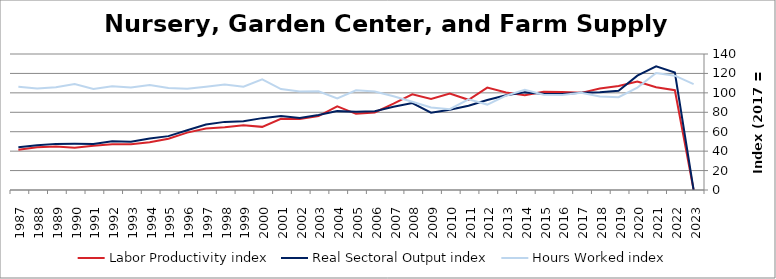
| Category | Labor Productivity index | Real Sectoral Output index | Hours Worked index |
|---|---|---|---|
| 2023.0 | 0 | 0 | 108.998 |
| 2022.0 | 102.74 | 120.933 | 117.708 |
| 2021.0 | 105.768 | 127.344 | 120.399 |
| 2020.0 | 111.733 | 117.761 | 105.394 |
| 2019.0 | 107.031 | 102.191 | 95.478 |
| 2018.0 | 104.576 | 100.656 | 96.252 |
| 2017.0 | 100 | 100 | 100 |
| 2016.0 | 100.993 | 98.719 | 97.748 |
| 2015.0 | 101.094 | 99.044 | 97.972 |
| 2014.0 | 97.437 | 100.491 | 103.134 |
| 2013.0 | 100.371 | 97.46 | 97.1 |
| 2012.0 | 105.362 | 92.647 | 87.932 |
| 2011.0 | 92.861 | 86.72 | 93.388 |
| 2010.0 | 99.325 | 82.58 | 83.141 |
| 2009.0 | 93.643 | 79.53 | 84.929 |
| 2008.0 | 98.503 | 89.439 | 90.799 |
| 2007.0 | 88.817 | 85.682 | 96.471 |
| 2006.0 | 79.822 | 80.999 | 101.475 |
| 2005.0 | 78.397 | 80.456 | 102.627 |
| 2004.0 | 86.055 | 81.193 | 94.35 |
| 2003.0 | 76.016 | 77.266 | 101.645 |
| 2002.0 | 73.075 | 74.148 | 101.468 |
| 2001.0 | 73.271 | 76.129 | 103.9 |
| 2000.0 | 64.986 | 73.978 | 113.836 |
| 1999.0 | 66.587 | 70.78 | 106.296 |
| 1998.0 | 64.63 | 70.128 | 108.506 |
| 1997.0 | 63.387 | 67.391 | 106.317 |
| 1996.0 | 59.078 | 61.57 | 104.218 |
| 1995.0 | 52.853 | 55.448 | 104.91 |
| 1994.0 | 49.073 | 53.002 | 108.008 |
| 1993.0 | 47.021 | 49.584 | 105.45 |
| 1992.0 | 47.001 | 50.163 | 106.728 |
| 1991.0 | 45.552 | 47.397 | 104.05 |
| 1990.0 | 43.62 | 47.537 | 108.979 |
| 1989.0 | 44.899 | 47.481 | 105.75 |
| 1988.0 | 44.02 | 46.024 | 104.554 |
| 1987.0 | 41.487 | 44.13 | 106.371 |